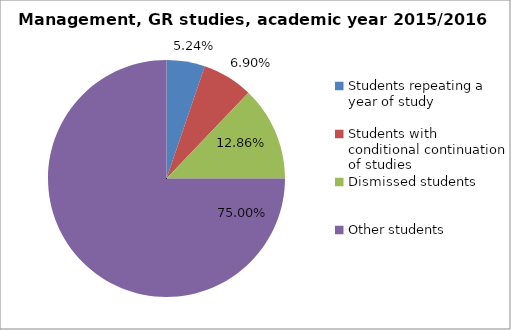
| Category | Series 0 |
|---|---|
| Students repeating a year of study | 22 |
| Students with conditional continuation of studies | 29 |
| Dismissed students | 54 |
| Other students | 315 |